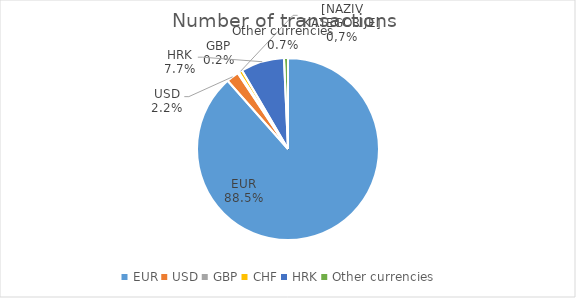
| Category | Number of transactions  |
|---|---|
| EUR | 7155661 |
| USD | 179391 |
| GBP | 18912 |
| CHF | 51834 |
| HRK | 624449 |
| Other currencies | 57182 |